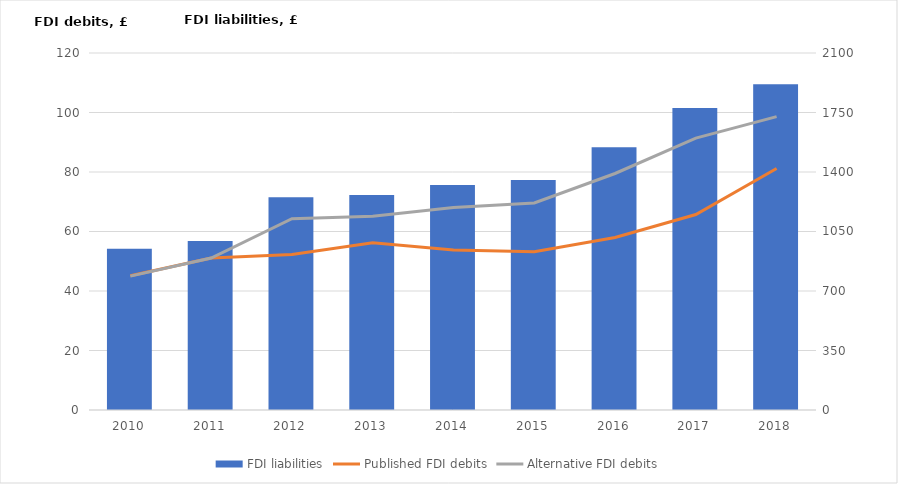
| Category | FDI liabilities |
|---|---|
| 2010.0 | 948.2 |
| 2011.0 | 994.1 |
| 2012.0 | 1250.9 |
| 2013.0 | 1265.3 |
| 2014.0 | 1323.7 |
| 2015.0 | 1353.2 |
| 2016.0 | 1545.7 |
| 2017.0 | 1776.6 |
| 2018.0 | 1916.8 |